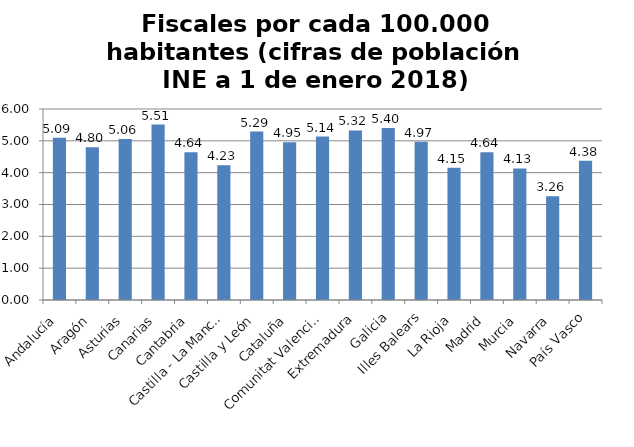
| Category | Series 0 |
|---|---|
| Andalucía | 5.093 |
| Aragón | 4.798 |
| Asturias | 5.06 |
| Canarias | 5.512 |
| Cantabria | 4.645 |
| Castilla - La Mancha | 4.231 |
| Castilla y León | 5.292 |
| Cataluña | 4.954 |
| Comunitat Valenciana | 5.135 |
| Extremadura | 5.325 |
| Galicia | 5.401 |
| Illes Balears | 4.97 |
| La Rioja | 4.155 |
| Madrid | 4.642 |
| Murcia | 4.134 |
| Navarra | 3.261 |
| País Vasco | 4.376 |